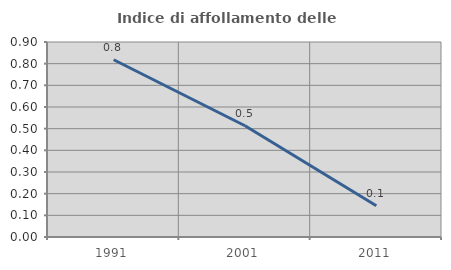
| Category | Indice di affollamento delle abitazioni  |
|---|---|
| 1991.0 | 0.818 |
| 2001.0 | 0.513 |
| 2011.0 | 0.144 |